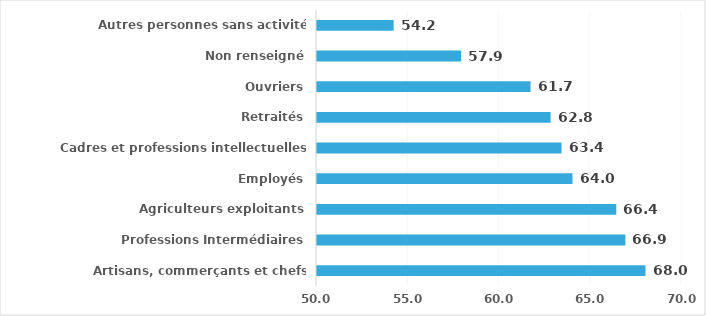
| Category | Series 0 |
|---|---|
| Artisans, commerçants et chefs d'entreprise | 68 |
| Professions Intermédiaires | 66.9 |
| Agriculteurs exploitants | 66.4 |
| Employés | 64 |
| Cadres et professions intellectuelles supérieures | 63.4 |
| Retraités | 62.8 |
| Ouvriers | 61.7 |
| Non renseigné | 57.9 |
| Autres personnes sans activité professionnelle | 54.2 |